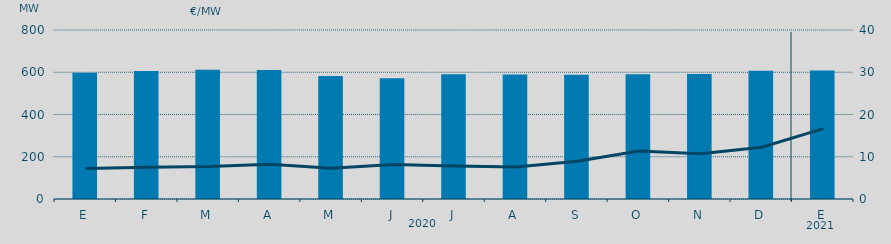
| Category | Energia (MWh) a subir |
|---|---|
| E | 597.488 |
| F | 605.632 |
| M | 611.351 |
| A | 610.483 |
| M | 582.745 |
| J | 571.897 |
| J | 590.058 |
| A | 589.661 |
| S | 587.738 |
| O | 590.796 |
| N | 591.888 |
| D | 607.198 |
| E | 607.872 |